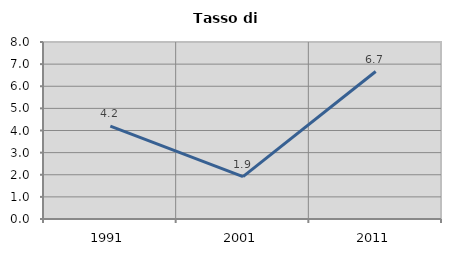
| Category | Tasso di disoccupazione   |
|---|---|
| 1991.0 | 4.196 |
| 2001.0 | 1.914 |
| 2011.0 | 6.667 |